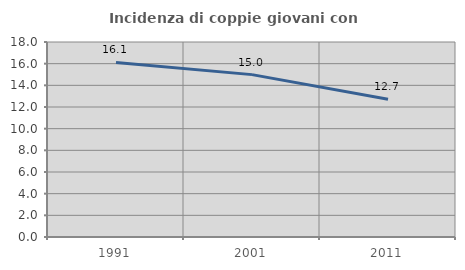
| Category | Incidenza di coppie giovani con figli |
|---|---|
| 1991.0 | 16.114 |
| 2001.0 | 14.988 |
| 2011.0 | 12.713 |